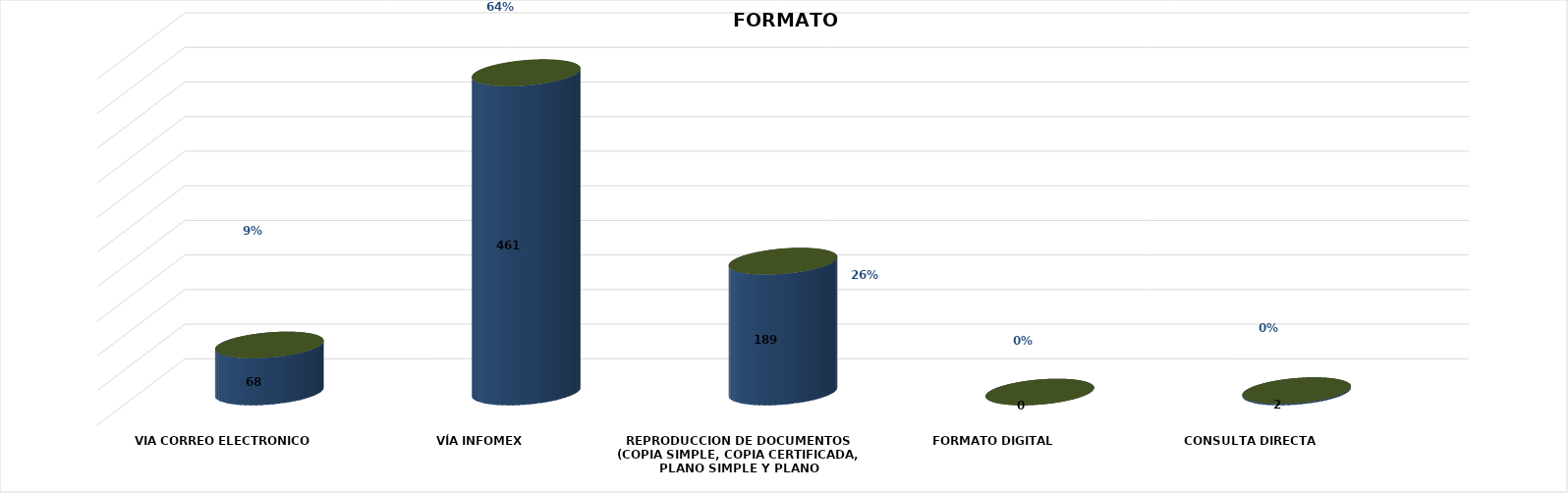
| Category | Series 0 | Series 1 | Series 2 | Series 3 | Series 4 |
|---|---|---|---|---|---|
| VIA CORREO ELECTRONICO |  |  |  | 68 | 0.094 |
| VÍA INFOMEX |  |  |  | 461 | 0.64 |
| REPRODUCCION DE DOCUMENTOS (COPIA SIMPLE, COPIA CERTIFICADA, PLANO SIMPLE Y PLANO CERTIFICADO) |  |  |  | 189 | 0.263 |
| FORMATO DIGITAL |  |  |  | 0 | 0 |
| CONSULTA DIRECTA |  |  |  | 2 | 0.003 |